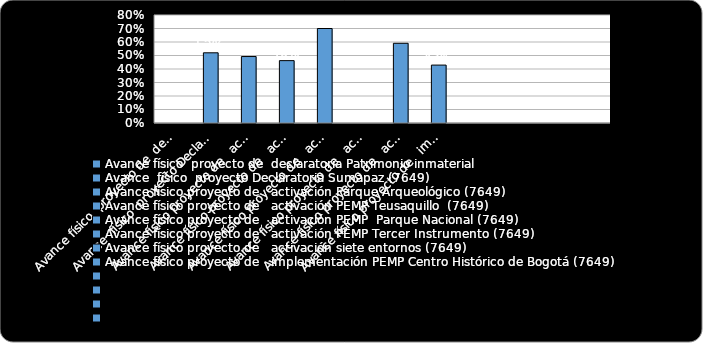
| Category | % Cumplimiento  |
|---|---|
| Avance físico  proyecto de  declaratoria Patrimonio inmaterial  | 0 |
| Avance  físico  proyecto Declaratoria Sumapaz (7649) | 0.52 |
| Avance físico proyecto de   activación Parque Arqueológico (7649)  | 0.492 |
| Avance físico proyecto de   activación PEMP Teusaquillo  (7649) | 0.462 |
| Avance físico proyecto de   activación PEMP  Parque Nacional (7649) | 0.7 |
| Avance físico proyecto de   activación PEMP Tercer Instrumento (7649) | 0 |
| Avance físico proyecto de   activación siete entornos (7649) | 0.59 |
| Avance físico proyecto de   implementación PEMP Centro Histórico de Bogotá (7649) | 0.429 |